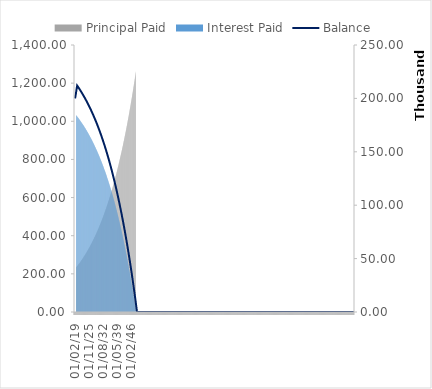
| Category | Principal Paid | Interest Paid |
|---|---|---|
| 01/02/19 | 0 | 0 |
| 01/03/19 | 0 | 0 |
| 01/04/19 | 0 | 0 |
| 01/05/19 | 0 | 0 |
| 01/06/19 | 0 | 0 |
| 01/07/19 | 0 | 0 |
| 01/08/19 | 0 | 0 |
| 01/09/19 | 0 | 0 |
| 01/10/19 | 0 | 0 |
| 01/11/19 | 0 | 0 |
| 01/12/19 | 0 | 0 |
| 01/01/20 | 0 | 0 |
| 01/02/20 | 233.551 | 1031.921 |
| 01/03/20 | 234.688 | 1030.784 |
| 01/04/20 | 235.831 | 1029.642 |
| 01/05/20 | 236.979 | 1028.494 |
| 01/06/20 | 238.132 | 1027.34 |
| 01/07/20 | 239.291 | 1026.181 |
| 01/08/20 | 240.456 | 1025.016 |
| 01/09/20 | 241.626 | 1023.846 |
| 01/10/20 | 242.802 | 1022.67 |
| 01/11/20 | 243.984 | 1021.488 |
| 01/12/20 | 245.172 | 1020.3 |
| 01/01/21 | 246.365 | 1019.107 |
| 01/02/21 | 247.564 | 1017.908 |
| 01/03/21 | 248.77 | 1016.703 |
| 01/04/21 | 249.98 | 1015.492 |
| 01/05/21 | 251.197 | 1014.275 |
| 01/06/21 | 252.42 | 1013.052 |
| 01/07/21 | 253.649 | 1011.824 |
| 01/08/21 | 254.883 | 1010.589 |
| 01/09/21 | 256.124 | 1009.348 |
| 01/10/21 | 257.371 | 1008.102 |
| 01/11/21 | 258.623 | 1006.849 |
| 01/12/21 | 259.882 | 1005.59 |
| 01/01/22 | 261.147 | 1004.325 |
| 01/02/22 | 262.418 | 1003.054 |
| 01/03/22 | 263.696 | 1001.776 |
| 01/04/22 | 264.979 | 1000.493 |
| 01/05/22 | 266.269 | 999.203 |
| 01/06/22 | 267.565 | 997.907 |
| 01/07/22 | 268.868 | 996.605 |
| 01/08/22 | 270.176 | 995.296 |
| 01/09/22 | 271.491 | 993.981 |
| 01/10/22 | 272.813 | 992.659 |
| 01/11/22 | 274.141 | 991.331 |
| 01/12/22 | 275.475 | 989.997 |
| 01/01/23 | 276.816 | 988.656 |
| 01/02/23 | 278.163 | 987.309 |
| 01/03/23 | 279.517 | 985.955 |
| 01/04/23 | 280.878 | 984.594 |
| 01/05/23 | 282.245 | 983.227 |
| 01/06/23 | 283.619 | 981.853 |
| 01/07/23 | 285 | 980.473 |
| 01/08/23 | 286.387 | 979.085 |
| 01/09/23 | 287.781 | 977.691 |
| 01/10/23 | 289.182 | 976.291 |
| 01/11/23 | 290.589 | 974.883 |
| 01/12/23 | 292.004 | 973.468 |
| 01/01/24 | 293.425 | 972.047 |
| 01/02/24 | 294.853 | 970.619 |
| 01/03/24 | 296.288 | 969.184 |
| 01/04/24 | 297.731 | 967.741 |
| 01/05/24 | 299.18 | 966.292 |
| 01/06/24 | 300.636 | 964.836 |
| 01/07/24 | 302.1 | 963.373 |
| 01/08/24 | 303.57 | 961.902 |
| 01/09/24 | 305.048 | 960.424 |
| 01/10/24 | 306.533 | 958.94 |
| 01/11/24 | 308.025 | 957.448 |
| 01/12/24 | 309.524 | 955.948 |
| 01/01/25 | 311.031 | 954.442 |
| 01/02/25 | 312.544 | 952.928 |
| 01/03/25 | 314.066 | 951.406 |
| 01/04/25 | 315.595 | 949.878 |
| 01/05/25 | 317.131 | 948.341 |
| 01/06/25 | 318.674 | 946.798 |
| 01/07/25 | 320.226 | 945.247 |
| 01/08/25 | 321.784 | 943.688 |
| 01/09/25 | 323.351 | 942.122 |
| 01/10/25 | 324.924 | 940.548 |
| 01/11/25 | 326.506 | 938.966 |
| 01/12/25 | 328.095 | 937.377 |
| 01/01/26 | 329.692 | 935.78 |
| 01/02/26 | 331.297 | 934.175 |
| 01/03/26 | 332.91 | 932.562 |
| 01/04/26 | 334.53 | 930.942 |
| 01/05/26 | 336.159 | 929.314 |
| 01/06/26 | 337.795 | 927.677 |
| 01/07/26 | 339.439 | 926.033 |
| 01/08/26 | 341.091 | 924.381 |
| 01/09/26 | 342.752 | 922.721 |
| 01/10/26 | 344.42 | 921.052 |
| 01/11/26 | 346.096 | 919.376 |
| 01/12/26 | 347.781 | 917.691 |
| 01/01/27 | 349.474 | 915.998 |
| 01/02/27 | 351.175 | 914.297 |
| 01/03/27 | 352.884 | 912.588 |
| 01/04/27 | 354.602 | 910.87 |
| 01/05/27 | 356.328 | 909.144 |
| 01/06/27 | 358.062 | 907.41 |
| 01/07/27 | 359.805 | 905.667 |
| 01/08/27 | 361.557 | 903.915 |
| 01/09/27 | 363.317 | 902.155 |
| 01/10/27 | 365.085 | 900.387 |
| 01/11/27 | 366.862 | 898.61 |
| 01/12/27 | 368.648 | 896.824 |
| 01/01/28 | 370.442 | 895.03 |
| 01/02/28 | 372.245 | 893.227 |
| 01/03/28 | 374.057 | 891.415 |
| 01/04/28 | 375.878 | 889.594 |
| 01/05/28 | 377.708 | 887.764 |
| 01/06/28 | 379.546 | 885.926 |
| 01/07/28 | 381.394 | 884.078 |
| 01/08/28 | 383.25 | 882.222 |
| 01/09/28 | 385.116 | 880.356 |
| 01/10/28 | 386.99 | 878.482 |
| 01/11/28 | 388.874 | 876.598 |
| 01/12/28 | 390.767 | 874.705 |
| 01/01/29 | 392.669 | 872.803 |
| 01/02/29 | 394.58 | 870.892 |
| 01/03/29 | 396.501 | 868.971 |
| 01/04/29 | 398.431 | 867.041 |
| 01/05/29 | 400.37 | 865.102 |
| 01/06/29 | 402.319 | 863.153 |
| 01/07/29 | 404.277 | 861.195 |
| 01/08/29 | 406.245 | 859.227 |
| 01/09/29 | 408.223 | 857.25 |
| 01/10/29 | 410.21 | 855.262 |
| 01/11/29 | 412.206 | 853.266 |
| 01/12/29 | 414.213 | 851.259 |
| 01/01/30 | 416.229 | 849.243 |
| 01/02/30 | 418.255 | 847.217 |
| 01/03/30 | 420.291 | 845.181 |
| 01/04/30 | 422.337 | 843.135 |
| 01/05/30 | 424.392 | 841.08 |
| 01/06/30 | 426.458 | 839.014 |
| 01/07/30 | 428.534 | 836.938 |
| 01/08/30 | 430.62 | 834.852 |
| 01/09/30 | 432.716 | 832.756 |
| 01/10/30 | 434.822 | 830.65 |
| 01/11/30 | 436.939 | 828.533 |
| 01/12/30 | 439.066 | 826.407 |
| 01/01/31 | 441.203 | 824.269 |
| 01/02/31 | 443.35 | 822.122 |
| 01/03/31 | 445.508 | 819.964 |
| 01/04/31 | 447.677 | 817.795 |
| 01/05/31 | 449.856 | 815.616 |
| 01/06/31 | 452.046 | 813.426 |
| 01/07/31 | 454.246 | 811.226 |
| 01/08/31 | 456.457 | 809.015 |
| 01/09/31 | 458.679 | 806.793 |
| 01/10/31 | 460.912 | 804.561 |
| 01/11/31 | 463.155 | 802.317 |
| 01/12/31 | 465.409 | 800.063 |
| 01/01/32 | 467.675 | 797.797 |
| 01/02/32 | 469.951 | 795.521 |
| 01/03/32 | 472.239 | 793.233 |
| 01/04/32 | 474.537 | 790.935 |
| 01/05/32 | 476.847 | 788.625 |
| 01/06/32 | 479.168 | 786.304 |
| 01/07/32 | 481.501 | 783.971 |
| 01/08/32 | 483.844 | 781.628 |
| 01/09/32 | 486.2 | 779.272 |
| 01/10/32 | 488.566 | 776.906 |
| 01/11/32 | 490.944 | 774.528 |
| 01/12/32 | 493.334 | 772.138 |
| 01/01/33 | 495.735 | 769.737 |
| 01/02/33 | 498.148 | 767.324 |
| 01/03/33 | 500.573 | 764.899 |
| 01/04/33 | 503.01 | 762.462 |
| 01/05/33 | 505.458 | 760.014 |
| 01/06/33 | 507.918 | 757.554 |
| 01/07/33 | 510.391 | 755.081 |
| 01/08/33 | 512.875 | 752.597 |
| 01/09/33 | 515.372 | 750.101 |
| 01/10/33 | 517.88 | 747.592 |
| 01/11/33 | 520.401 | 745.071 |
| 01/12/33 | 522.934 | 742.538 |
| 01/01/34 | 525.48 | 739.993 |
| 01/02/34 | 528.037 | 737.435 |
| 01/03/34 | 530.608 | 734.865 |
| 01/04/34 | 533.19 | 732.282 |
| 01/05/34 | 535.786 | 729.686 |
| 01/06/34 | 538.394 | 727.079 |
| 01/07/34 | 541.014 | 724.458 |
| 01/08/34 | 543.648 | 721.824 |
| 01/09/34 | 546.294 | 719.178 |
| 01/10/34 | 548.953 | 716.519 |
| 01/11/34 | 551.625 | 713.847 |
| 01/12/34 | 554.31 | 711.162 |
| 01/01/35 | 557.008 | 708.464 |
| 01/02/35 | 559.72 | 705.753 |
| 01/03/35 | 562.444 | 703.028 |
| 01/04/35 | 565.182 | 700.29 |
| 01/05/35 | 567.933 | 697.539 |
| 01/06/35 | 570.697 | 694.775 |
| 01/07/35 | 573.475 | 691.997 |
| 01/08/35 | 576.267 | 689.206 |
| 01/09/35 | 579.072 | 686.401 |
| 01/10/35 | 581.89 | 683.582 |
| 01/11/35 | 584.723 | 680.75 |
| 01/12/35 | 587.569 | 677.903 |
| 01/01/36 | 590.429 | 675.043 |
| 01/02/36 | 593.303 | 672.169 |
| 01/03/36 | 596.191 | 669.281 |
| 01/04/36 | 599.093 | 666.379 |
| 01/05/36 | 602.009 | 663.463 |
| 01/06/36 | 604.939 | 660.533 |
| 01/07/36 | 607.884 | 657.589 |
| 01/08/36 | 610.843 | 654.63 |
| 01/09/36 | 613.816 | 651.656 |
| 01/10/36 | 616.804 | 648.669 |
| 01/11/36 | 619.806 | 645.666 |
| 01/12/36 | 622.823 | 642.649 |
| 01/01/37 | 625.855 | 639.618 |
| 01/02/37 | 628.901 | 636.571 |
| 01/03/37 | 631.962 | 633.51 |
| 01/04/37 | 635.038 | 630.434 |
| 01/05/37 | 638.129 | 627.343 |
| 01/06/37 | 641.235 | 624.237 |
| 01/07/37 | 644.357 | 621.115 |
| 01/08/37 | 647.493 | 617.979 |
| 01/09/37 | 650.645 | 614.827 |
| 01/10/37 | 653.812 | 611.66 |
| 01/11/37 | 656.994 | 608.478 |
| 01/12/37 | 660.192 | 605.28 |
| 01/01/38 | 663.406 | 602.066 |
| 01/02/38 | 666.635 | 598.837 |
| 01/03/38 | 669.88 | 595.592 |
| 01/04/38 | 673.14 | 592.332 |
| 01/05/38 | 676.417 | 589.055 |
| 01/06/38 | 679.71 | 585.763 |
| 01/07/38 | 683.018 | 582.454 |
| 01/08/38 | 686.343 | 579.129 |
| 01/09/38 | 689.683 | 575.789 |
| 01/10/38 | 693.041 | 572.432 |
| 01/11/38 | 696.414 | 569.058 |
| 01/12/38 | 699.804 | 565.668 |
| 01/01/39 | 703.21 | 562.262 |
| 01/02/39 | 706.633 | 558.839 |
| 01/03/39 | 710.073 | 555.4 |
| 01/04/39 | 713.529 | 551.943 |
| 01/05/39 | 717.002 | 548.47 |
| 01/06/39 | 720.492 | 544.98 |
| 01/07/39 | 723.999 | 541.473 |
| 01/08/39 | 727.523 | 537.949 |
| 01/09/39 | 731.064 | 534.408 |
| 01/10/39 | 734.623 | 530.849 |
| 01/11/39 | 738.199 | 527.273 |
| 01/12/39 | 741.792 | 523.68 |
| 01/01/40 | 745.403 | 520.069 |
| 01/02/40 | 749.031 | 516.441 |
| 01/03/40 | 752.677 | 512.795 |
| 01/04/40 | 756.341 | 509.131 |
| 01/05/40 | 760.022 | 505.45 |
| 01/06/40 | 763.722 | 501.751 |
| 01/07/40 | 767.439 | 498.033 |
| 01/08/40 | 771.175 | 494.298 |
| 01/09/40 | 774.928 | 490.544 |
| 01/10/40 | 778.7 | 486.772 |
| 01/11/40 | 782.491 | 482.981 |
| 01/12/40 | 786.3 | 479.173 |
| 01/01/41 | 790.127 | 475.345 |
| 01/02/41 | 793.973 | 471.499 |
| 01/03/41 | 797.838 | 467.635 |
| 01/04/41 | 801.721 | 463.751 |
| 01/05/41 | 805.624 | 459.849 |
| 01/06/41 | 809.545 | 455.927 |
| 01/07/41 | 813.485 | 451.987 |
| 01/08/41 | 817.445 | 448.027 |
| 01/09/41 | 821.424 | 444.048 |
| 01/10/41 | 825.422 | 440.05 |
| 01/11/41 | 829.44 | 436.032 |
| 01/12/41 | 833.478 | 431.995 |
| 01/01/42 | 837.534 | 427.938 |
| 01/02/42 | 841.611 | 423.861 |
| 01/03/42 | 845.708 | 419.764 |
| 01/04/42 | 849.824 | 415.648 |
| 01/05/42 | 853.961 | 411.511 |
| 01/06/42 | 858.118 | 407.355 |
| 01/07/42 | 862.295 | 403.178 |
| 01/08/42 | 866.492 | 398.98 |
| 01/09/42 | 870.709 | 394.763 |
| 01/10/42 | 874.948 | 390.524 |
| 01/11/42 | 879.207 | 386.266 |
| 01/12/42 | 883.486 | 381.986 |
| 01/01/43 | 887.787 | 377.686 |
| 01/02/43 | 892.108 | 373.364 |
| 01/03/43 | 896.45 | 369.022 |
| 01/04/43 | 900.814 | 364.658 |
| 01/05/43 | 905.199 | 360.274 |
| 01/06/43 | 909.605 | 355.867 |
| 01/07/43 | 914.032 | 351.44 |
| 01/08/43 | 918.481 | 346.991 |
| 01/09/43 | 922.952 | 342.52 |
| 01/10/43 | 927.445 | 338.028 |
| 01/11/43 | 931.959 | 333.513 |
| 01/12/43 | 936.495 | 328.977 |
| 01/01/44 | 941.054 | 324.418 |
| 01/02/44 | 945.634 | 319.838 |
| 01/03/44 | 950.237 | 315.235 |
| 01/04/44 | 954.863 | 310.609 |
| 01/05/44 | 959.51 | 305.962 |
| 01/06/44 | 964.181 | 301.291 |
| 01/07/44 | 968.874 | 296.598 |
| 01/08/44 | 973.59 | 291.882 |
| 01/09/44 | 978.329 | 287.143 |
| 01/10/44 | 983.091 | 282.381 |
| 01/11/44 | 987.877 | 277.596 |
| 01/12/44 | 992.685 | 272.787 |
| 01/01/45 | 997.517 | 267.955 |
| 01/02/45 | 1002.372 | 263.1 |
| 01/03/45 | 1007.252 | 258.221 |
| 01/04/45 | 1012.154 | 253.318 |
| 01/05/45 | 1017.081 | 248.391 |
| 01/06/45 | 1022.032 | 243.44 |
| 01/07/45 | 1027.007 | 238.466 |
| 01/08/45 | 1032.006 | 233.467 |
| 01/09/45 | 1037.029 | 228.443 |
| 01/10/45 | 1042.077 | 223.395 |
| 01/11/45 | 1047.149 | 218.323 |
| 01/12/45 | 1052.246 | 213.226 |
| 01/01/46 | 1057.368 | 208.104 |
| 01/02/46 | 1062.515 | 202.957 |
| 01/03/46 | 1067.687 | 197.785 |
| 01/04/46 | 1072.884 | 192.588 |
| 01/05/46 | 1078.106 | 187.366 |
| 01/06/46 | 1083.354 | 182.118 |
| 01/07/46 | 1088.627 | 176.845 |
| 01/08/46 | 1093.926 | 171.546 |
| 01/09/46 | 1099.251 | 166.221 |
| 01/10/46 | 1104.601 | 160.871 |
| 01/11/46 | 1109.978 | 155.494 |
| 01/12/46 | 1115.381 | 150.091 |
| 01/01/47 | 1120.81 | 144.662 |
| 01/02/47 | 1126.266 | 139.206 |
| 01/03/47 | 1131.748 | 133.724 |
| 01/04/47 | 1137.257 | 128.215 |
| 01/05/47 | 1142.792 | 122.68 |
| 01/06/47 | 1148.355 | 117.117 |
| 01/07/47 | 1153.945 | 111.528 |
| 01/08/47 | 1159.561 | 105.911 |
| 01/09/47 | 1165.206 | 100.266 |
| 01/10/47 | 1170.877 | 94.595 |
| 01/11/47 | 1176.577 | 88.895 |
| 01/12/47 | 1182.304 | 83.168 |
| 01/01/48 | 1188.059 | 77.413 |
| 01/02/48 | 1193.842 | 71.63 |
| 01/03/48 | 1199.653 | 65.819 |
| 01/04/48 | 1205.492 | 59.98 |
| 01/05/48 | 1211.36 | 54.112 |
| 01/06/48 | 1217.256 | 48.216 |
| 01/07/48 | 1223.181 | 42.291 |
| 01/08/48 | 1229.135 | 36.337 |
| 01/09/48 | 1235.118 | 30.354 |
| 01/10/48 | 1241.13 | 24.342 |
| 01/11/48 | 1247.171 | 18.301 |
| 01/12/48 | 1253.242 | 12.23 |
| 01/01/49 | 1259.342 | 6.13 |